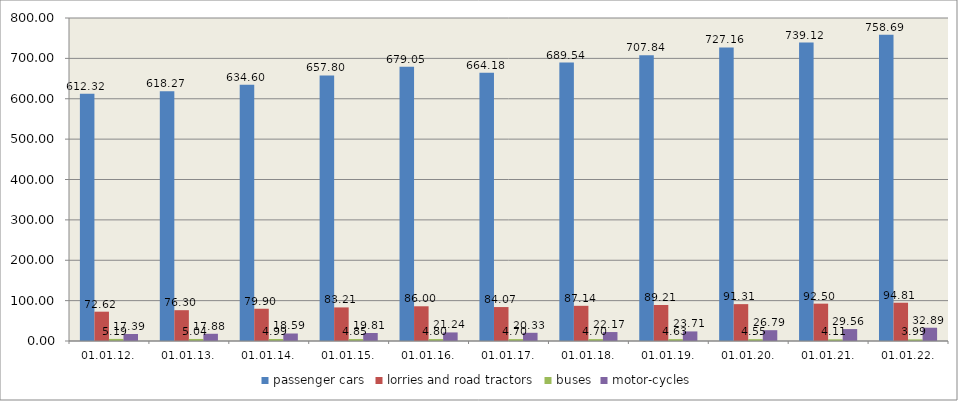
| Category | passenger cars | lorries and road tractors | buses | motor-cycles |
|---|---|---|---|---|
| 01.01.12. | 612.321 | 72.622 | 5.186 | 17.385 |
| 01.01.13. | 618.274 | 76.303 | 5.044 | 17.879 |
| 01.01.14. | 634.603 | 79.899 | 4.989 | 18.587 |
| 01.01.15. | 657.799 | 83.205 | 4.845 | 19.807 |
| 01.01.16. | 679.048 | 85.998 | 4.797 | 21.241 |
| 01.01.17. | 664.177 | 84.067 | 4.696 | 20.329 |
| 01.01.18. | 689.536 | 87.143 | 4.701 | 22.166 |
| 01.01.19. | 707.841 | 89.211 | 4.632 | 23.713 |
| 01.01.20. | 727.164 | 91.311 | 4.549 | 26.785 |
| 01.01.21. | 739.124 | 92.499 | 4.105 | 29.561 |
| 01.01.22. | 758.688 | 94.811 | 3.992 | 32.893 |